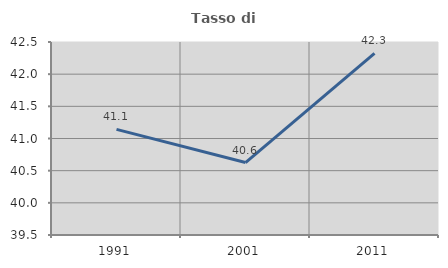
| Category | Tasso di occupazione   |
|---|---|
| 1991.0 | 41.141 |
| 2001.0 | 40.626 |
| 2011.0 | 42.324 |